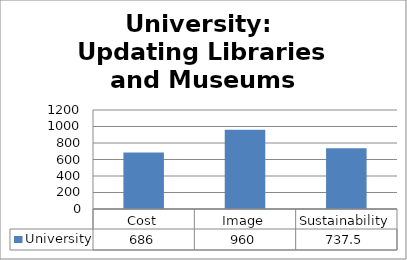
| Category | University |
|---|---|
| Cost | 686 |
| Image | 960 |
| Sustainability | 737.5 |